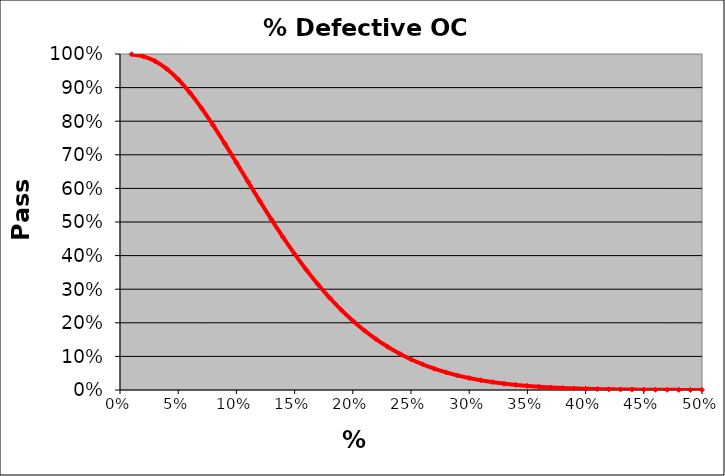
| Category | PASS 
RATE |
|---|---|
| 0.01 | 0.999 |
| 0.02 | 0.993 |
| 0.03 | 0.979 |
| 0.04 | 0.956 |
| 0.05 | 0.925 |
| 0.06 | 0.885 |
| 0.07 | 0.839 |
| 0.08 | 0.788 |
| 0.09 | 0.733 |
| 0.1 | 0.677 |
| 0.11 | 0.62 |
| 0.12 | 0.563 |
| 0.13 | 0.508 |
| 0.14 | 0.455 |
| 0.15 | 0.405 |
| 0.16 | 0.358 |
| 0.17 | 0.315 |
| 0.18 | 0.275 |
| 0.19 | 0.239 |
| 0.2 | 0.206 |
| 0.21 | 0.177 |
| 0.22 | 0.151 |
| 0.23 | 0.128 |
| 0.24 | 0.109 |
| 0.25 | 0.091 |
| 0.26 | 0.076 |
| 0.27 | 0.064 |
| 0.28 | 0.053 |
| 0.29 | 0.043 |
| 0.3 | 0.035 |
| 0.31 | 0.029 |
| 0.32 | 0.023 |
| 0.33 | 0.019 |
| 0.34 | 0.015 |
| 0.35 | 0.012 |
| 0.36 | 0.01 |
| 0.37 | 0.008 |
| 0.38 | 0.006 |
| 0.39 | 0.005 |
| 0.4 | 0.004 |
| 0.41 | 0.003 |
| 0.42 | 0.002 |
| 0.43 | 0.002 |
| 0.44 | 0.001 |
| 0.45 | 0.001 |
| 0.46 | 0.001 |
| 0.47 | 0.001 |
| 0.48 | 0 |
| 0.49 | 0 |
| 0.499999999999999 | 0 |